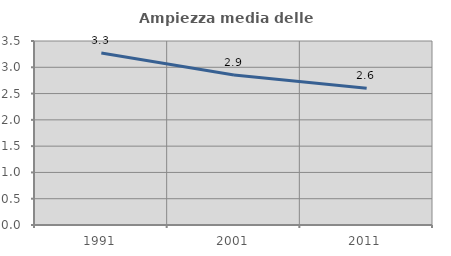
| Category | Ampiezza media delle famiglie |
|---|---|
| 1991.0 | 3.271 |
| 2001.0 | 2.853 |
| 2011.0 | 2.601 |